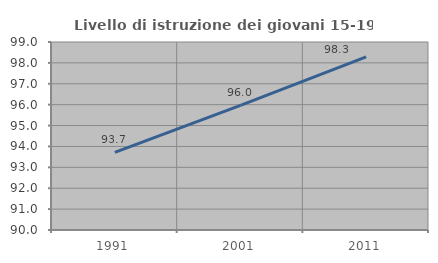
| Category | Livello di istruzione dei giovani 15-19 anni |
|---|---|
| 1991.0 | 93.714 |
| 2001.0 | 95.968 |
| 2011.0 | 98.291 |